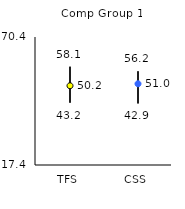
| Category | 25th | 75th | Mean |
|---|---|---|---|
| TFS | 43.2 | 58.1 | 50.21 |
| CSS | 42.9 | 56.2 | 51.04 |